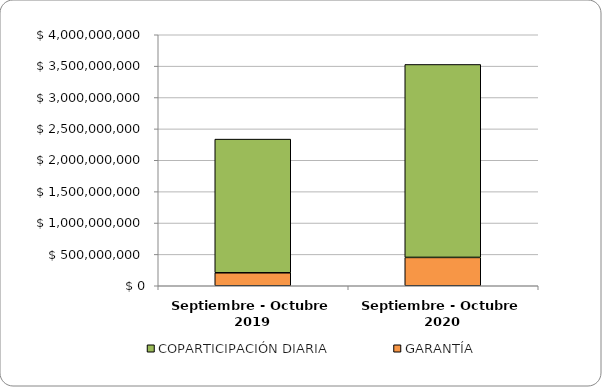
| Category | GARANTÍA | COPARTICIPACIÓN DIARIA |
|---|---|---|
| Septiembre - Octubre 2019 | 206854210.16 | 2130092136.523 |
| Septiembre - Octubre 2020 | 451549398.32 | 3075218073.27 |